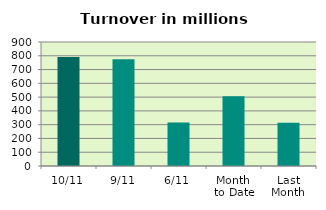
| Category | Series 0 |
|---|---|
| 10/11 | 791.907 |
| 9/11 | 774.144 |
| 6/11 | 316.168 |
| Month 
to Date | 506.749 |
| Last
Month | 314.143 |